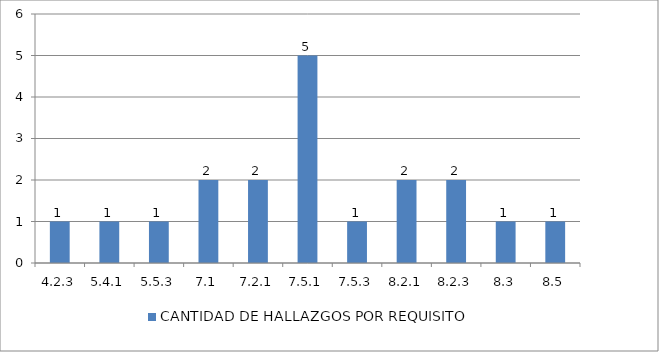
| Category | CANTIDAD DE HALLAZGOS POR REQUISITO |
|---|---|
| 4.2.3 | 1 |
| 5.4.1 | 1 |
| 5.5.3 | 1 |
| 7.1 | 2 |
| 7.2.1 | 2 |
| 7.5.1 | 5 |
| 7.5.3 | 1 |
| 8.2.1 | 2 |
| 8.2.3 | 2 |
| 8.3 | 1 |
| 8.5 | 1 |